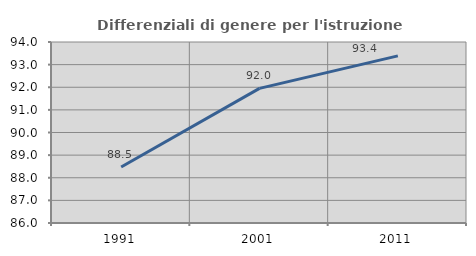
| Category | Differenziali di genere per l'istruzione superiore |
|---|---|
| 1991.0 | 88.472 |
| 2001.0 | 91.951 |
| 2011.0 | 93.387 |